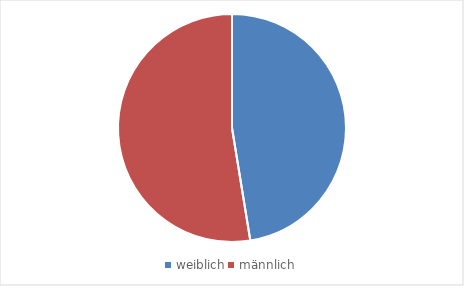
| Category | Series 0 |
|---|---|
| weiblich | 157 |
| männlich | 174 |